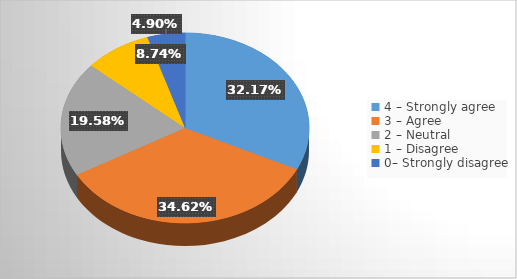
| Category | Series 0 |
|---|---|
| 4 – Strongly agree  | 0.322 |
| 3 – Agree  | 0.346 |
| 2 – Neutral   | 0.196 |
| 1 – Disagree   | 0.087 |
| 0– Strongly disagree | 0.049 |